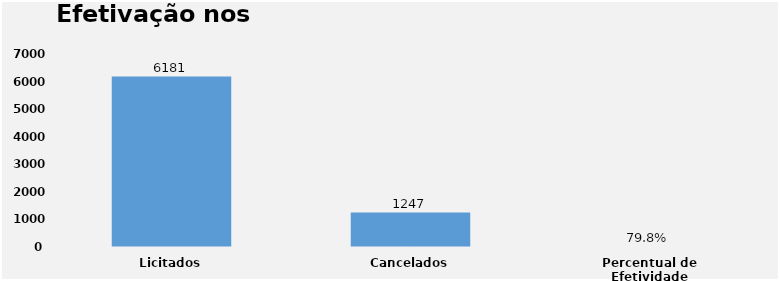
| Category | Series 0 |
|---|---|
| Licitados | 6181 |
| Cancelados | 1247 |
| Percentual de Efetividade | 0.798 |